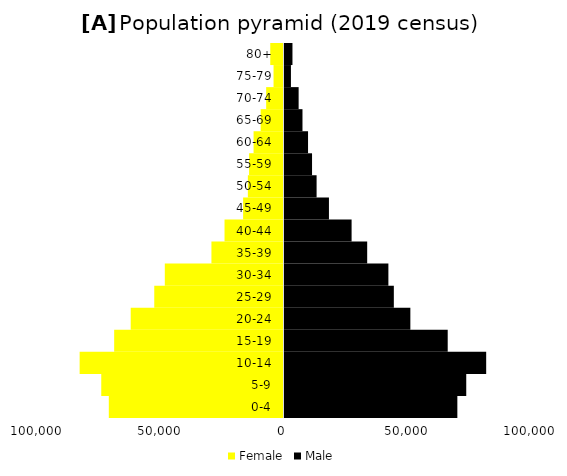
| Category | Female | Male |
|---|---|---|
| 0-4 | -70870 | 70122 |
| 5-9 | -73933 | 73732 |
| 10-14 | -82705 | 81818 |
| 15-19 | -68693 | 66211 |
| 20-24 | -61983 | 51057 |
| 25-29 | -52430 | 44356 |
| 30-34 | -48152 | 42146 |
| 35-39 | -29237 | 33546 |
| 40-44 | -23924 | 27219 |
| 45-49 | -16384 | 18030 |
| 50-54 | -14459 | 13022 |
| 55-59 | -13958 | 11174 |
| 60-64 | -12144 | 9552 |
| 65-69 | -9273 | 7294 |
| 70-74 | -7035 | 5733 |
| 75-79 | -4040 | 2611 |
| 80+ | -5374 | 3229 |